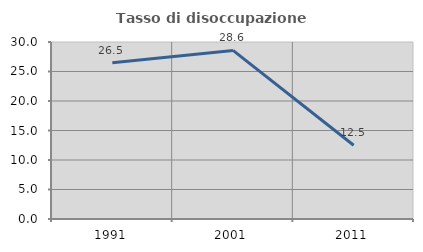
| Category | Tasso di disoccupazione giovanile  |
|---|---|
| 1991.0 | 26.471 |
| 2001.0 | 28.571 |
| 2011.0 | 12.5 |